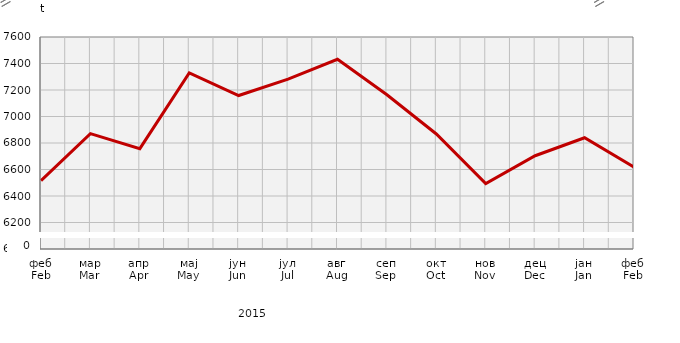
| Category | Прикупљање крављег млијека
Collecting of cow’s milk |
|---|---|
| феб
Feb | 6516.44 |
| мар
Mar | 6870.8 |
| апр
Apr | 6757.289 |
| мај
May | 7329.328 |
| јун
Jun | 7158.306 |
| јул
Jul | 7282.65 |
| авг
Aug | 7431.863 |
| сеп
Sep | 7163.964 |
| окт
Oct | 6867.986 |
| нов
Nov | 6493.2 |
| дец
Dec | 6703.986 |
| јан
Jan | 6839.677 |
| феб
Feb | 6618.5 |